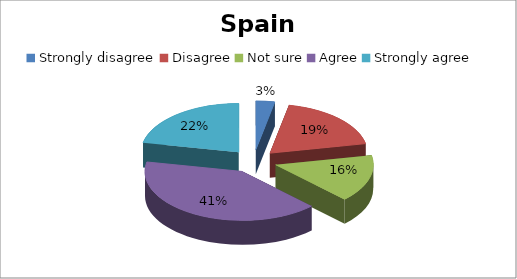
| Category | Series 0 |
|---|---|
| Strongly disagree | 1 |
| Disagree | 6 |
| Not sure | 5 |
| Agree | 13 |
| Strongly agree | 7 |